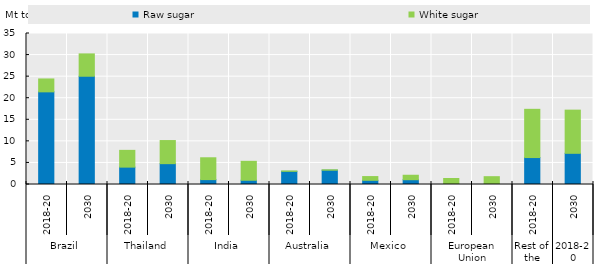
| Category | Raw sugar | White sugar |
|---|---|---|
| 0 | 21.475 | 2.989 |
| 1 | 25.092 | 5.18 |
| 2 | 4.026 | 3.887 |
| 3 | 4.832 | 5.355 |
| 4 | 1.133 | 5.061 |
| 5 | 0.986 | 4.384 |
| 6 | 3.048 | 0.083 |
| 7 | 3.314 | 0.089 |
| 8 | 0.972 | 0.867 |
| 9 | 1.11 | 1.033 |
| 10 | 0.054 | 1.337 |
| 11 | 0.044 | 1.768 |
| 12 | 6.248 | 11.177 |
| 13 | 7.227 | 10.009 |